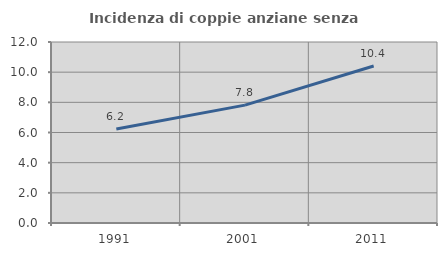
| Category | Incidenza di coppie anziane senza figli  |
|---|---|
| 1991.0 | 6.238 |
| 2001.0 | 7.814 |
| 2011.0 | 10.409 |